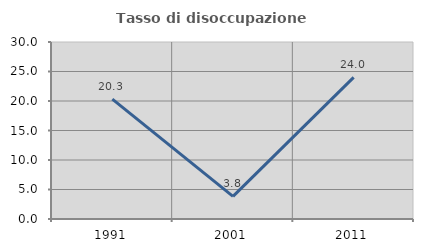
| Category | Tasso di disoccupazione giovanile  |
|---|---|
| 1991.0 | 20.312 |
| 2001.0 | 3.846 |
| 2011.0 | 24 |